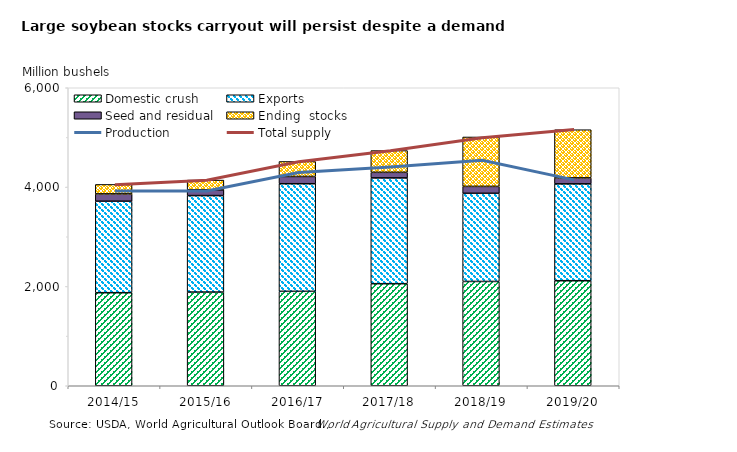
| Category | Domestic | Exports | Seed and | Ending  |
|---|---|---|---|---|
| 2014/15 | 1873.494 | 1842.175 | 147.007 | 190.61 |
| 2015/16 | 1886.237 | 1942.639 | 115.325 | 196.729 |
| 2016/17 | 1901.198 | 2166.417 | 146.296 | 301.595 |
| 2017/18 | 2055 | 2130 | 112.123 | 438.105 |
| 2018/19 | 2100 | 1775 | 138.988 | 995 |
| 2019/20 | 2115 | 1950 | 120 | 970 |